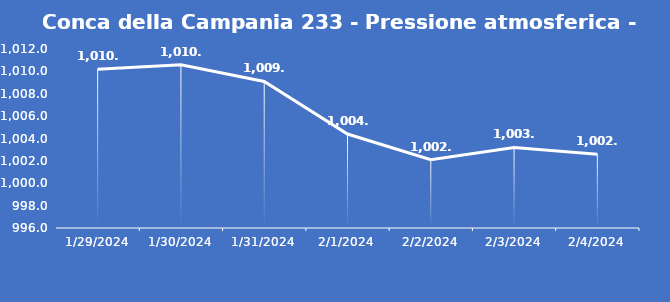
| Category | Conca della Campania 233 - Pressione atmosferica - Grezzo (hPa) |
|---|---|
| 1/29/24 | 1010.2 |
| 1/30/24 | 1010.6 |
| 1/31/24 | 1009.1 |
| 2/1/24 | 1004.4 |
| 2/2/24 | 1002.1 |
| 2/3/24 | 1003.2 |
| 2/4/24 | 1002.6 |